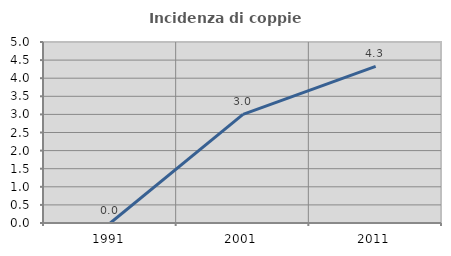
| Category | Incidenza di coppie miste |
|---|---|
| 1991.0 | 0 |
| 2001.0 | 3 |
| 2011.0 | 4.324 |